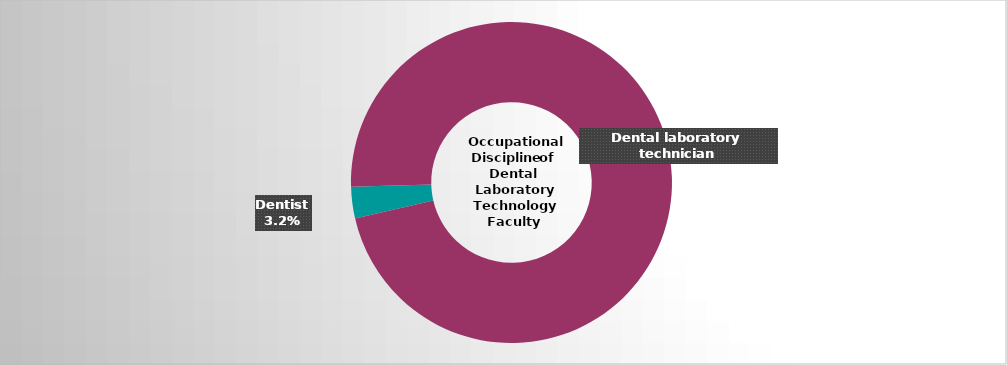
| Category | Series 2 |
|---|---|
| Both dental laboratory technician and dental assistant | 0 |
| Dentist | 0.032 |
| Dental laboratory technician | 0.968 |
| Both dental hygienist and dental assistant | 0 |